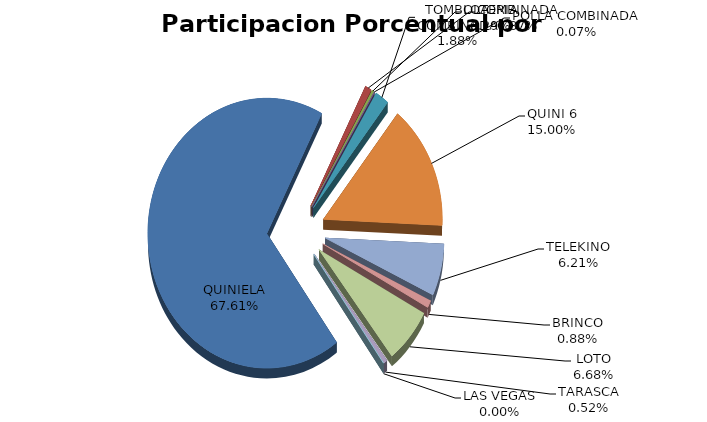
| Category | Series 0 |
|---|---|
| QUINIELA | 17087828.493 |
| COMBINADA | 219116.55 |
| LOTERIA | 73281.758 |
| POLLA COMBINADA | 16951.7 |
| TOMBOLA COMBINADA | 474678 |
| QUINI 6 | 3791251.09 |
| TELEKINO | 1569847.5 |
| BRINCO | 221791.286 |
| LOTO | 1687200.93 |
| TARASCA | 131041.35 |
| LAS VEGAS | 0 |